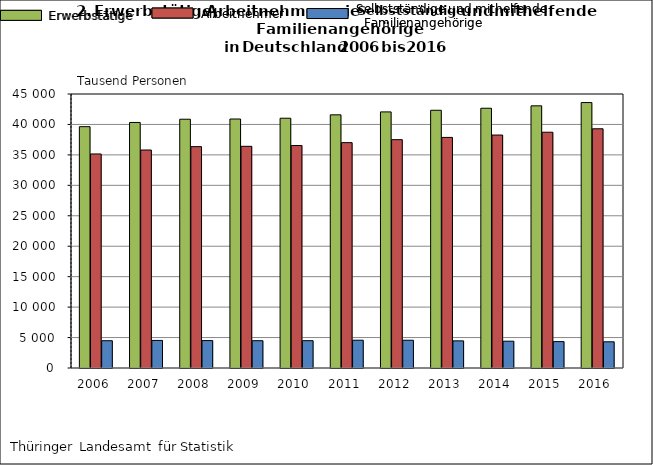
| Category | Erwerbstätige | Arbeitnehmer | Selbstständige
und mithelfende
Familienangehörige |
|---|---|---|---|
| 2006.0 | 39635 | 35152 | 4483 |
| 2007.0 | 40325 | 35798 | 4527 |
| 2008.0 | 40856 | 36353 | 4503 |
| 2009.0 | 40892 | 36407 | 4485 |
| 2010.0 | 41020 | 36533 | 4487 |
| 2011.0 | 41577 | 37014 | 4563 |
| 2012.0 | 42061 | 37501 | 4560 |
| 2013.0 | 42328 | 37870 | 4458 |
| 2014.0 | 42662 | 38260 | 4402 |
| 2015.0 | 43057 | 38721 | 4336 |
| 2016.0 | 43595 | 39290 | 4305 |